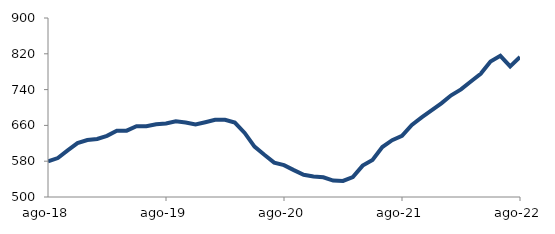
| Category | Series 0 |
|---|---|
| 2018-08-01 | 579.547 |
| 2018-09-01 | 587.097 |
| 2018-10-01 | 604.2 |
| 2018-11-01 | 620.436 |
| 2018-12-01 | 627.396 |
| 2019-01-01 | 629.794 |
| 2019-02-01 | 636.624 |
| 2019-03-01 | 648.17 |
| 2019-04-01 | 648.206 |
| 2019-05-01 | 658.035 |
| 2019-06-01 | 657.952 |
| 2019-07-01 | 662.49 |
| 2019-08-01 | 664.104 |
| 2019-09-01 | 669.196 |
| 2019-10-01 | 666.5 |
| 2019-11-01 | 662.174 |
| 2019-12-01 | 667.143 |
| 2020-01-01 | 672.455 |
| 2020-02-01 | 672.659 |
| 2020-03-01 | 666.213 |
| 2020-04-01 | 643.145 |
| 2020-05-01 | 612.572 |
| 2020-06-01 | 594.292 |
| 2020-07-01 | 576.858 |
| 2020-08-01 | 571.224 |
| 2020-09-01 | 560.032 |
| 2020-10-01 | 549.541 |
| 2020-11-01 | 545.982 |
| 2020-12-01 | 544.038 |
| 2021-01-01 | 536.772 |
| 2021-02-01 | 535.938 |
| 2021-03-01 | 544.717 |
| 2021-04-01 | 570.16 |
| 2021-05-01 | 582.981 |
| 2021-06-01 | 611.684 |
| 2021-07-01 | 627.037 |
| 2021-08-01 | 636.642 |
| 2021-09-01 | 661.114 |
| 2021-10-01 | 677.889 |
| 2021-11-01 | 693.389 |
| 2021-12-01 | 709.343 |
| 2022-01-01 | 727.31 |
| 2022-02-01 | 740.539 |
| 2022-03-01 | 758.027 |
| 2022-04-01 | 775.241 |
| 2022-05-01 | 802.956 |
| 2022-06-01 | 815.434 |
| 2022-07-01 | 791.89 |
| 2022-08-01 | 812.76 |